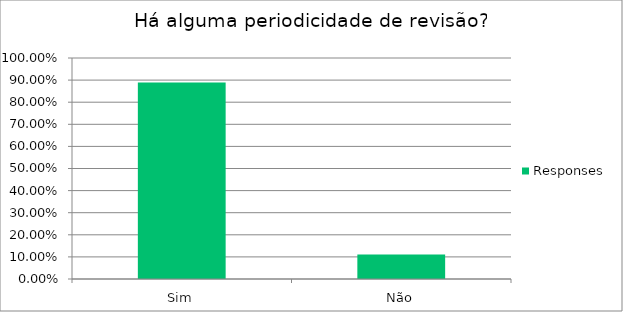
| Category | Responses |
|---|---|
| Sim | 0.889 |
| Não | 0.111 |